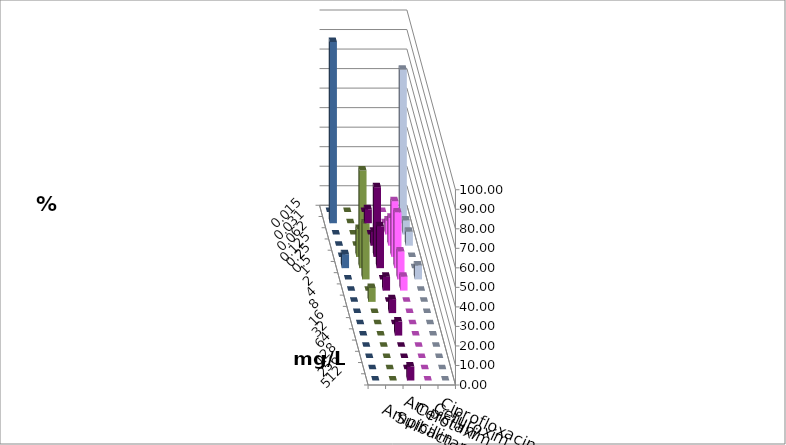
| Category | Ampicillin | Ampicillin/ Sulbactam | Cefotaxim | Cefuroxim | Ciprofloxacin |
|---|---|---|---|---|---|
| 0.015 | 0 | 0 | 0 | 0 | 0 |
| 0.031 | 7.143 | 0 | 78.571 | 0 | 92.857 |
| 0.062 | 0 | 7.143 | 7.143 | 0 | 0 |
| 0.125 | 7.143 | 14.286 | 7.143 | 0 | 0 |
| 0.25 | 35.714 | 28.571 | 0 | 14.286 | 0 |
| 0.5 | 21.429 | 28.571 | 0 | 50 | 7.143 |
| 1.0 | 0 | 14.286 | 7.143 | 28.571 | 0 |
| 2.0 | 7.143 | 7.143 | 0 | 0 | 0 |
| 4.0 | 0 | 0 | 0 | 7.143 | 0 |
| 8.0 | 7.143 | 0 | 0 | 0 | 0 |
| 16.0 | 0 | 0 | 0 | 0 | 0 |
| 32.0 | 7.143 | 0 | 0 | 0 | 0 |
| 64.0 | 0 | 0 | 0 | 0 | 0 |
| 128.0 | 0 | 0 | 0 | 0 | 0 |
| 256.0 | 0 | 0 | 0 | 0 | 0 |
| 512.0 | 7.143 | 0 | 0 | 0 | 0 |